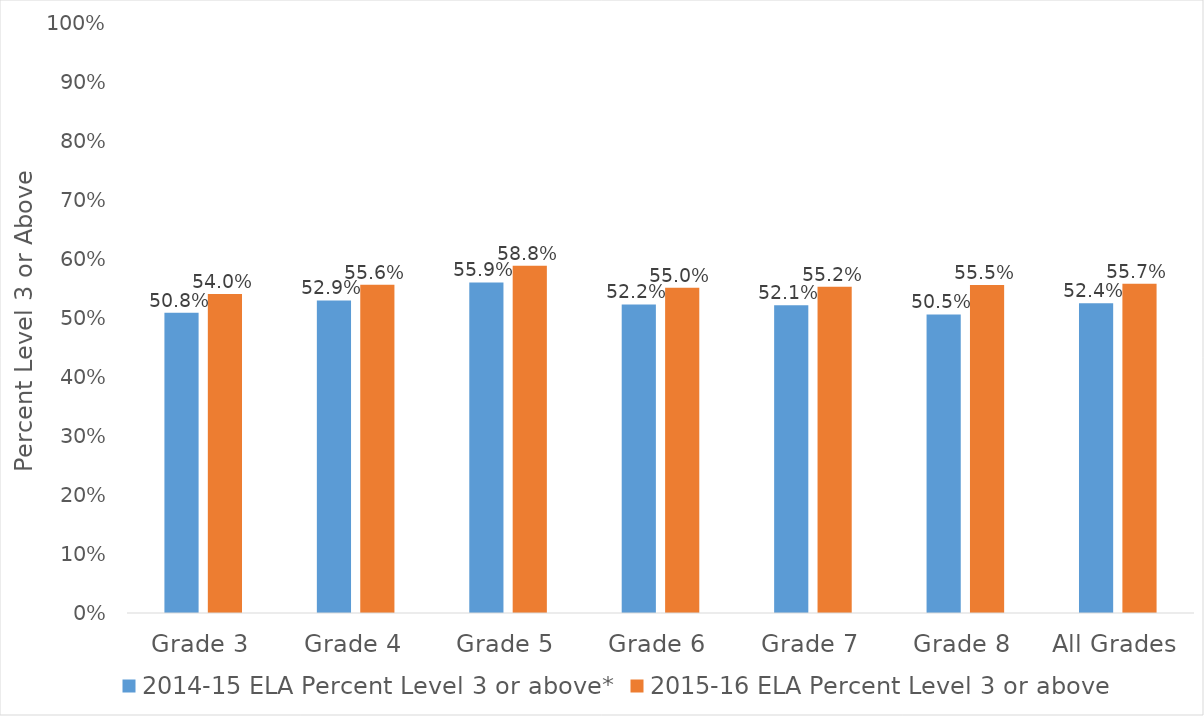
| Category | 2014-15 ELA Percent Level 3 or above* | 2015-16 ELA Percent Level 3 or above |
|---|---|---|
| Grade 3 | 0.508 | 0.54 |
| Grade 4 | 0.529 | 0.556 |
| Grade 5 | 0.559 | 0.588 |
| Grade 6 | 0.522 | 0.55 |
| Grade 7 | 0.521 | 0.552 |
| Grade 8 | 0.505 | 0.555 |
| All Grades | 0.524 | 0.557 |